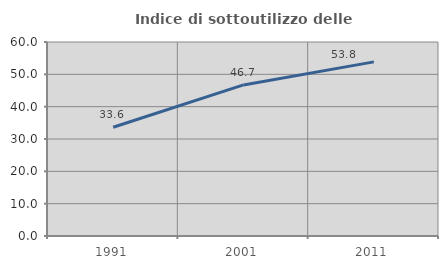
| Category | Indice di sottoutilizzo delle abitazioni  |
|---|---|
| 1991.0 | 33.628 |
| 2001.0 | 46.729 |
| 2011.0 | 53.846 |